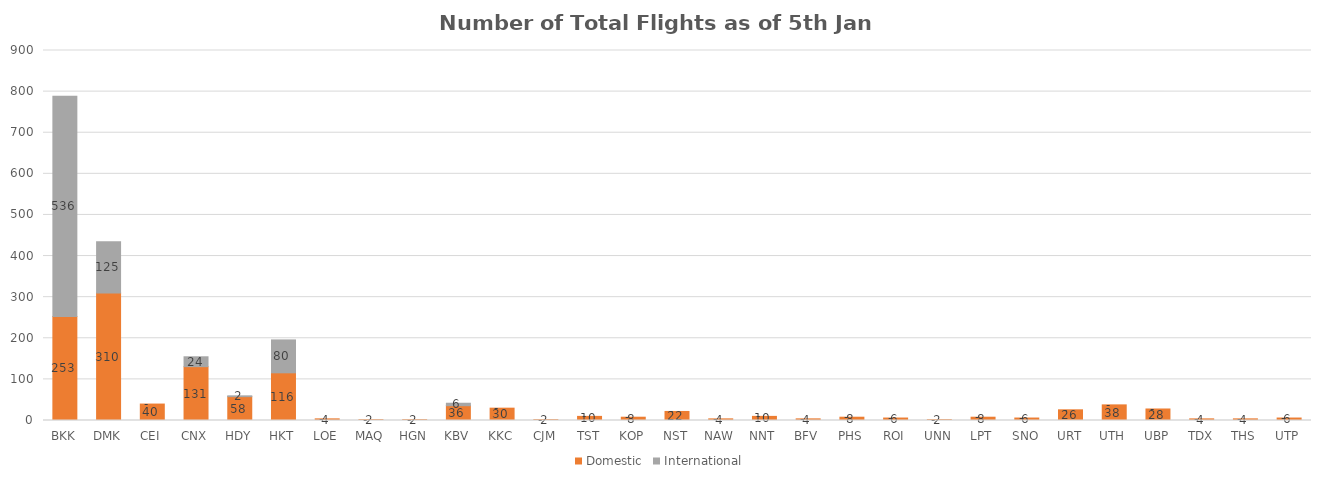
| Category | Domestic | International |
|---|---|---|
| BKK | 253 | 536 |
| DMK | 310 | 125 |
| CEI | 40 | 0 |
| CNX | 131 | 24 |
| HDY | 58 | 2 |
| HKT | 116 | 80 |
| LOE | 4 | 0 |
| MAQ | 2 | 0 |
| HGN | 2 | 0 |
| KBV | 36 | 6 |
| KKC | 30 | 0 |
| CJM | 2 | 0 |
| TST | 10 | 0 |
| KOP | 8 | 0 |
| NST | 22 | 0 |
| NAW | 4 | 0 |
| NNT | 10 | 0 |
| BFV | 4 | 0 |
| PHS | 8 | 0 |
| ROI | 6 | 0 |
| UNN | 2 | 0 |
| LPT | 8 | 0 |
| SNO | 6 | 0 |
| URT | 26 | 0 |
| UTH | 38 | 0 |
| UBP | 28 | 0 |
| TDX | 4 | 0 |
| THS | 4 | 0 |
| UTP | 6 | 0 |